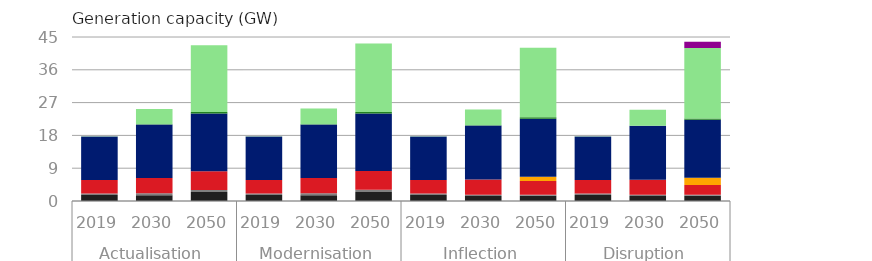
| Category | Coal | Oil | Natural gas | Nuclear | Hydro | Biofuels and waste | Other renewables | Hydrogen |
|---|---|---|---|---|---|---|---|---|
| 0 | 1.651 | 0.399 | 3.744 | 0 | 11.917 | 0.006 | 0.036 | 0 |
| 1 | 1.589 | 0.569 | 4.187 | 0 | 14.662 | 0.026 | 4.229 | 0 |
| 2 | 2.449 | 0.569 | 5.137 | 0 | 15.847 | 0.401 | 18.346 | 0 |
| 3 | 1.651 | 0.399 | 3.744 | 0 | 11.917 | 0.006 | 0.036 | 0 |
| 4 | 1.589 | 0.569 | 4.187 | 0 | 14.662 | 0.026 | 4.326 | 0 |
| 5 | 2.499 | 0.569 | 5.137 | 0 | 15.827 | 0.401 | 18.777 | 0 |
| 6 | 1.651 | 0.399 | 3.744 | 0 | 11.917 | 0.006 | 0.036 | 0 |
| 7 | 1.383 | 0.326 | 4.187 | 0 | 14.847 | 0.026 | 4.326 | 0 |
| 8 | 1.413 | 0.27 | 3.796 | 1.2 | 15.887 | 0.401 | 19.077 | 0 |
| 9 | 1.651 | 0.399 | 3.744 | 0 | 11.917 | 0.006 | 0.036 | 0 |
| 10 | 1.383 | 0.326 | 4.097 | 0 | 14.847 | 0.026 | 4.352 | 0 |
| 11 | 1.413 | 0.27 | 2.696 | 2 | 15.887 | 0.401 | 19.332 | 1.7 |